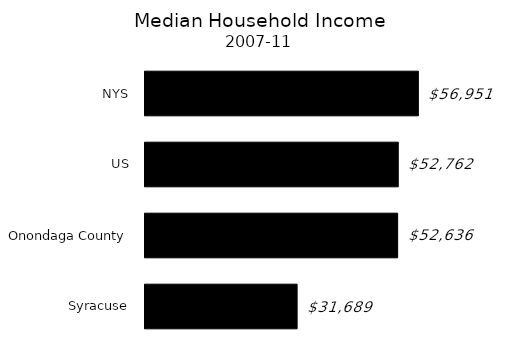
| Category | Series 0 |
|---|---|
| Syracuse | 31689 |
| Onondaga County | 52636 |
| US | 52762 |
| NYS | 56951 |